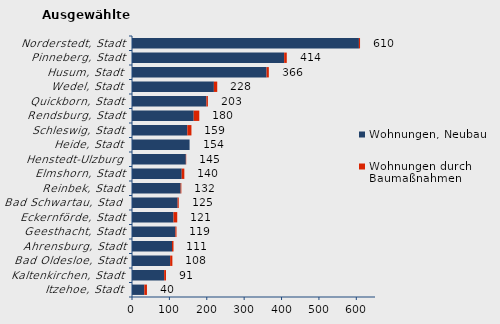
| Category | Wohnungen, Neubau | Wohnungen durch Baumaßnahmen | Series 2 |
|---|---|---|---|
| Itzehoe, Stadt | 33 | 7 | 40 |
| Kaltenkirchen, Stadt | 86 | 5 | 91 |
| Bad Oldesloe, Stadt | 102 | 6 | 108 |
| Ahrensburg, Stadt | 107 | 4 | 111 |
| Geesthacht, Stadt | 116 | 3 | 119 |
| Eckernförde, Stadt | 111 | 10 | 121 |
| Bad Schwartau, Stadt | 122 | 3 | 125 |
| Reinbek, Stadt | 130 | 2 | 132 |
| Elmshorn, Stadt | 133 | 7 | 140 |
| Henstedt-Ulzburg | 144 | 1 | 145 |
| Heide, Stadt | 154 | 0 | 154 |
| Schleswig, Stadt | 148 | 11 | 159 |
| Rendsburg, Stadt | 165 | 15 | 180 |
| Quickborn, Stadt | 199 | 4 | 203 |
| Wedel, Stadt | 219 | 9 | 228 |
| Husum, Stadt | 360 | 6 | 366 |
| Pinneberg, Stadt | 407 | 7 | 414 |
| Norderstedt, Stadt | 607 | 3 | 610 |